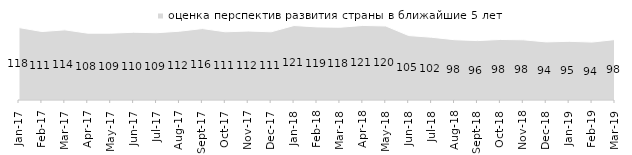
| Category | оценка перспектив развития страны в ближайшие 5 лет |
|---|---|
| 2017-01-01 | 117.55 |
| 2017-02-01 | 111.15 |
| 2017-03-01 | 113.85 |
| 2017-04-01 | 108.45 |
| 2017-05-01 | 108.5 |
| 2017-06-01 | 109.95 |
| 2017-07-01 | 109.2 |
| 2017-08-01 | 111.65 |
| 2017-09-01 | 115.95 |
| 2017-10-01 | 110.7 |
| 2017-11-01 | 111.95 |
| 2017-12-01 | 110.7 |
| 2018-01-01 | 120.9 |
| 2018-02-01 | 118.65 |
| 2018-03-01 | 118.1 |
| 2018-04-01 | 121 |
| 2018-05-01 | 120.15 |
| 2018-06-01 | 104.6 |
| 2018-07-01 | 101.85 |
| 2018-08-01 | 97.85 |
| 2018-09-01 | 96.4 |
| 2018-10-01 | 98.25 |
| 2018-11-01 | 97.705 |
| 2018-12-01 | 94.3 |
| 2019-01-01 | 95.25 |
| 2019-02-01 | 94.05 |
| 2019-03-01 | 98.11 |